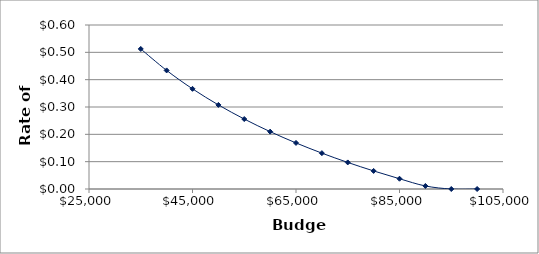
| Category | Series 0 |
|---|---|
| 35000.0 | 0.512 |
| 40000.0 | 0.434 |
| 45000.0 | 0.366 |
| 50000.0 | 0.308 |
| 55000.0 | 0.256 |
| 60000.0 | 0.21 |
| 65000.0 | 0.169 |
| 70000.0 | 0.131 |
| 75000.0 | 0.097 |
| 80000.0 | 0.066 |
| 85000.0 | 0.038 |
| 90000.0 | 0.011 |
| 95000.0 | 0 |
| 100000.0 | 0 |